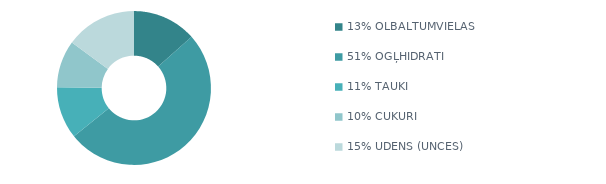
| Category | Series 0 |
|---|---|
| 13% OLBALTUMVIELAS | 915 |
| 51% OGĻHIDRĀTI | 3460 |
| 11% TAUKI | 745 |
| 10% CUKURI | 675 |
| 15% ŪDENS (UNCES) | 1018 |